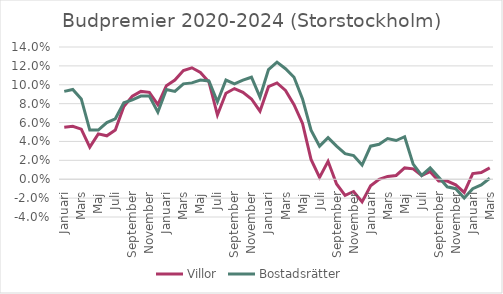
| Category | Villor | Bostadsrätter |
|---|---|---|
| Januari | 0.055 | 0.093 |
| Februari | 0.056 | 0.095 |
| Mars | 0.053 | 0.085 |
| April | 0.034 | 0.052 |
| Maj | 0.048 | 0.052 |
| Juni | 0.046 | 0.06 |
| Juli | 0.052 | 0.064 |
| Augusti | 0.077 | 0.081 |
| September | 0.088 | 0.084 |
| Oktober | 0.093 | 0.088 |
| November | 0.092 | 0.088 |
| December | 0.079 | 0.071 |
| Januari | 0.099 | 0.095 |
| Februari | 0.105 | 0.093 |
| Mars | 0.115 | 0.101 |
| April | 0.118 | 0.102 |
| Maj | 0.113 | 0.105 |
| Juni | 0.103 | 0.104 |
| Juli | 0.068 | 0.082 |
| Augusti | 0.091 | 0.105 |
| September | 0.096 | 0.101 |
| Oktober | 0.092 | 0.105 |
| November | 0.085 | 0.108 |
| December | 0.072 | 0.087 |
| Januari | 0.098 | 0.116 |
| Februari | 0.102 | 0.124 |
| Mars | 0.094 | 0.117 |
| April | 0.079 | 0.108 |
| Maj | 0.059 | 0.085 |
| Juni | 0.021 | 0.052 |
| Juli | 0.002 | 0.035 |
| Augusti | 0.019 | 0.044 |
| September | -0.005 | 0.035 |
| Oktober | -0.017 | 0.027 |
| November | -0.013 | 0.025 |
| December | -0.024 | 0.015 |
| Januari | -0.007 | 0.035 |
| Februari | 0 | 0.037 |
| Mars | 0.003 | 0.043 |
| April | 0.004 | 0.041 |
| Maj | 0.012 | 0.045 |
| Juni | 0.011 | 0.016 |
| Juli | 0.004 | 0.004 |
| Augusti | 0.008 | 0.012 |
| September | -0.002 | 0.002 |
| Oktober | -0.002 | -0.008 |
| November | -0.006 | -0.01 |
| December | -0.014 | -0.02 |
| Januari | 0.006 | -0.01 |
| Februari | 0.007 | -0.006 |
| Mars | 0.012 | 0.001 |